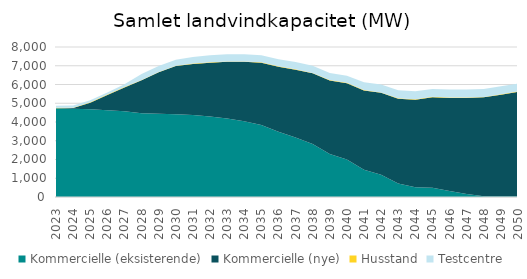
| Category | Kommercielle (eksisterende) | Kommercielle (nye) | Husstand | Testcentre |
|---|---|---|---|---|
| 2023.0 | 4731.41 | 0 | 22.1 | 110 |
| 2024.0 | 4704.6 | 39.6 | 22.2 | 110 |
| 2025.0 | 4682.24 | 342.7 | 22.3 | 110 |
| 2026.0 | 4626.37 | 814.7 | 22.4 | 110 |
| 2027.0 | 4579.69 | 1259.7 | 22.51 | 150 |
| 2028.0 | 4461.84 | 1759.7 | 22.6 | 310 |
| 2029.0 | 4440.71 | 2209.7 | 22.7 | 310 |
| 2030.0 | 4411.06 | 2569.7 | 22.8 | 310 |
| 2031.0 | 4371.1 | 2719.7 | 22.9 | 350 |
| 2032.0 | 4290.88 | 2869.7 | 23 | 380 |
| 2033.0 | 4190.2 | 3019.7 | 23.1 | 380 |
| 2034.0 | 4040.28 | 3169.7 | 23.2 | 380 |
| 2035.0 | 3839.7 | 3319.7 | 23.3 | 380 |
| 2036.0 | 3474.28 | 3469.7 | 23.4 | 380 |
| 2037.0 | 3170.38 | 3619.7 | 23.5 | 380 |
| 2038.0 | 2825.69 | 3769.7 | 23.61 | 380 |
| 2039.0 | 2294.37 | 3919.7 | 23.7 | 380 |
| 2040.0 | 1996.19 | 4069.7 | 23.8 | 380 |
| 2041.0 | 1458.34 | 4219.7 | 23.9 | 420 |
| 2042.0 | 1184.53 | 4369.7 | 24 | 420 |
| 2043.0 | 725.37 | 4519.7 | 24.1 | 420 |
| 2044.0 | 520.42 | 4669.7 | 24.2 | 420 |
| 2045.0 | 499.14 | 4819.7 | 24.3 | 420 |
| 2046.0 | 314.99 | 4969.7 | 24.4 | 420 |
| 2047.0 | 165.59 | 5119.7 | 24.5 | 420 |
| 2048.0 | 44.14 | 5269.7 | 24.6 | 420 |
| 2049.0 | 37.69 | 5419.7 | 24.71 | 420 |
| 2050.0 | 35.14 | 5569.7 | 24.8 | 420 |